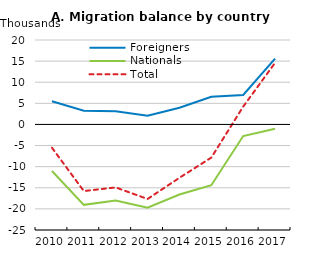
| Category | Foreigners | Nationals |
|---|---|---|
| 2010.0 | 5.513 | -11.02 |
| 2011.0 | 3.261 | -19.04 |
| 2012.0 | 3.125 | -18.04 |
| 2013.0 | 2.057 | -19.71 |
| 2014.0 | 3.962 | -16.6 |
| 2015.0 | 6.538 | -14.39 |
| 2016.0 | 6.97 | -2.75 |
| 2017.0 | 15.589 | -1.004 |